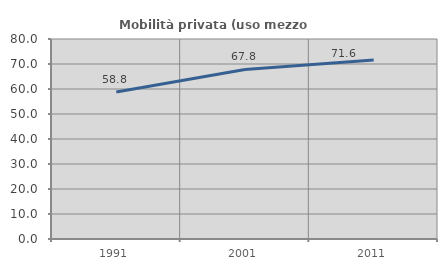
| Category | Mobilità privata (uso mezzo privato) |
|---|---|
| 1991.0 | 58.779 |
| 2001.0 | 67.82 |
| 2011.0 | 71.572 |